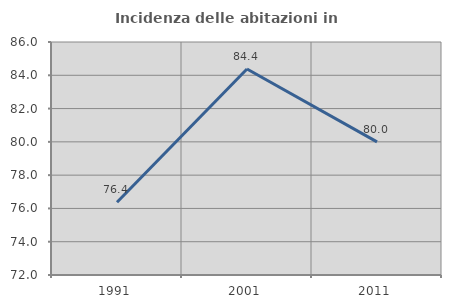
| Category | Incidenza delle abitazioni in proprietà  |
|---|---|
| 1991.0 | 76.374 |
| 2001.0 | 84.375 |
| 2011.0 | 80 |